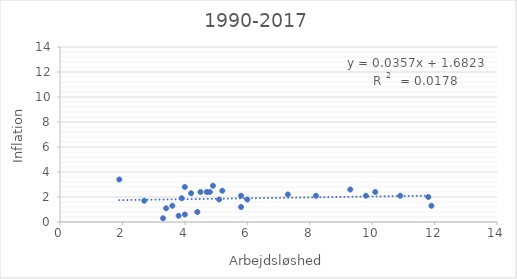
| Category | Series 0 |
|---|---|
| 9.3 | 2.6 |
| 10.1 | 2.4 |
| 10.9 | 2.1 |
| 11.9 | 1.3 |
| 11.8 | 2 |
| 9.8 | 2.1 |
| 8.2 | 2.1 |
| 7.3 | 2.2 |
| 6.0 | 1.8 |
| 5.2 | 2.5 |
| 4.9 | 2.9 |
| 4.7 | 2.4 |
| 4.8 | 2.4 |
| 5.8 | 2.1 |
| 5.8 | 1.2 |
| 5.1 | 1.8 |
| 3.9 | 1.9 |
| 2.7 | 1.7 |
| 1.9 | 3.4 |
| 3.6 | 1.3 |
| 4.2 | 2.3 |
| 4.0 | 2.8 |
| 4.5 | 2.4 |
| 4.4 | 0.8 |
| 4.0 | 0.6 |
| 3.8 | 0.5 |
| 3.3 | 0.3 |
| 3.4 | 1.1 |